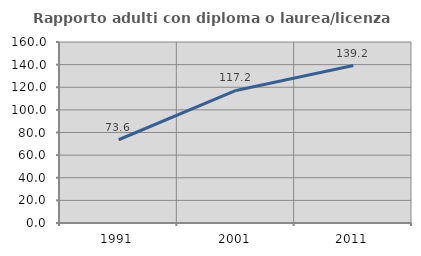
| Category | Rapporto adulti con diploma o laurea/licenza media  |
|---|---|
| 1991.0 | 73.585 |
| 2001.0 | 117.183 |
| 2011.0 | 139.174 |